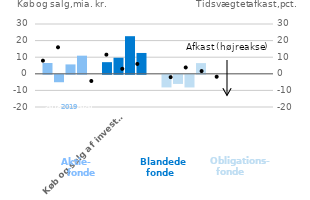
| Category | 2018 | 2019 | 2020 | 2021 ÅTD |
|---|---|---|---|---|
|  | 6.52 | -4.48 | 5.66 | 10.92 |
| Køb og salg af investeringsbeviser | 7.01 | 9.68 | 22.66 | 12.55 |